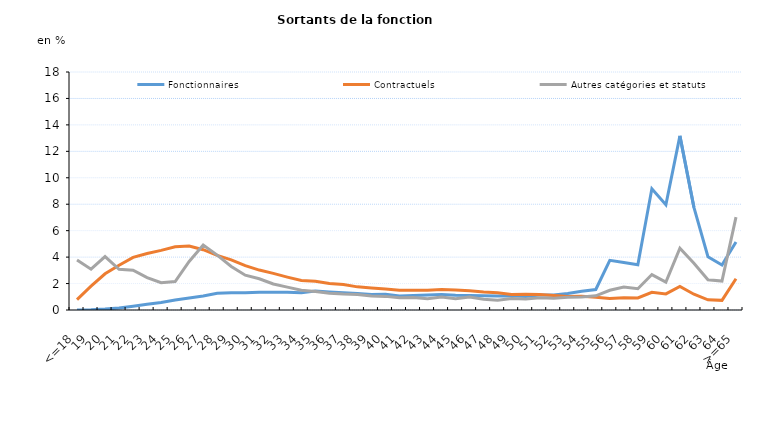
| Category | Fonctionnaires | Contractuels | Autres catégories et statuts |
|---|---|---|---|
| <=18 | 0 | 0.79 | 3.79 |
| 19 | 0.02 | 1.8 | 3.09 |
| 20 | 0.07 | 2.74 | 4.04 |
| 21 | 0.15 | 3.38 | 3.08 |
| 22 | 0.28 | 3.98 | 3.01 |
| 23 | 0.43 | 4.27 | 2.45 |
| 24 | 0.56 | 4.51 | 2.06 |
| 25 | 0.75 | 4.78 | 2.15 |
| 26 | 0.91 | 4.84 | 3.67 |
| 27 | 1.06 | 4.56 | 4.91 |
| 28 | 1.26 | 4.13 | 4.15 |
| 29 | 1.31 | 3.79 | 3.29 |
| 30 | 1.31 | 3.35 | 2.63 |
| 31 | 1.35 | 3.02 | 2.36 |
| 32 | 1.35 | 2.77 | 1.97 |
| 33 | 1.35 | 2.49 | 1.73 |
| 34 | 1.31 | 2.23 | 1.49 |
| 35 | 1.43 | 2.18 | 1.4 |
| 36 | 1.36 | 2 | 1.27 |
| 37 | 1.3 | 1.93 | 1.21 |
| 38 | 1.25 | 1.75 | 1.18 |
| 39 | 1.17 | 1.67 | 1.06 |
| 40 | 1.19 | 1.59 | 1.03 |
| 41 | 1.06 | 1.5 | 0.93 |
| 42 | 1.09 | 1.5 | 0.94 |
| 43 | 1.14 | 1.49 | 0.85 |
| 44 | 1.17 | 1.55 | 0.98 |
| 45 | 1.12 | 1.51 | 0.85 |
| 46 | 1.1 | 1.45 | 0.99 |
| 47 | 1.08 | 1.36 | 0.81 |
| 48 | 1.05 | 1.31 | 0.74 |
| 49 | 1.08 | 1.18 | 0.87 |
| 50 | 1.03 | 1.2 | 0.84 |
| 51 | 1.13 | 1.17 | 0.93 |
| 52 | 1.13 | 1.09 | 0.88 |
| 53 | 1.25 | 1.03 | 0.97 |
| 54 | 1.42 | 1.04 | 0.98 |
| 55 | 1.55 | 0.97 | 1.07 |
| 56 | 3.76 | 0.87 | 1.49 |
| 57 | 3.59 | 0.93 | 1.73 |
| 58 | 3.42 | 0.91 | 1.61 |
| 59 | 9.17 | 1.34 | 2.68 |
| 60 | 7.96 | 1.22 | 2.11 |
| 61 | 13.17 | 1.78 | 4.67 |
| 62 | 7.76 | 1.19 | 3.53 |
| 63 | 4.03 | 0.77 | 2.29 |
| 64 | 3.4 | 0.73 | 2.19 |
| >=65 | 5.15 | 2.36 | 7.02 |